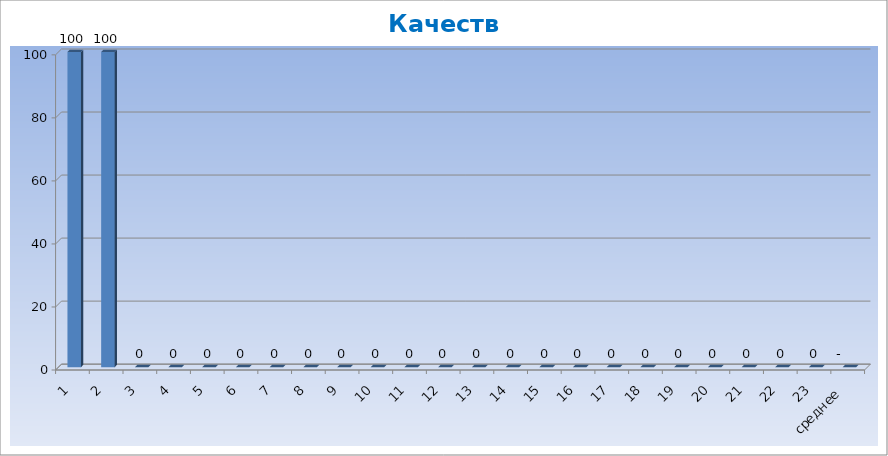
| Category | Series 0 |
|---|---|
| 1 | 100 |
| 2 | 100 |
| 3 | 0 |
| 4 | 0 |
| 5 | 0 |
| 6 | 0 |
| 7 | 0 |
| 8 | 0 |
| 9 | 0 |
| 10 | 0 |
| 11 | 0 |
| 12 | 0 |
| 13 | 0 |
| 14 | 0 |
| 15 | 0 |
| 16 | 0 |
| 17 | 0 |
| 18 | 0 |
| 19 | 0 |
| 20 | 0 |
| 21 | 0 |
| 22 | 0 |
| 23 | 0 |
| среднее | 0 |